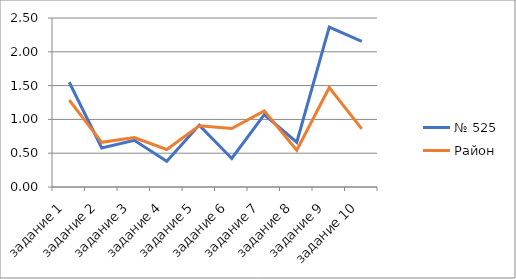
| Category | № 525 | Район |
|---|---|---|
| задание 1 | 1.549 | 1.284 |
| задание 2 | 0.577 | 0.661 |
| задание 3 | 0.69 | 0.733 |
| задание 4 | 0.38 | 0.555 |
| задание 5 | 0.915 | 0.906 |
| задание 6 | 0.423 | 0.865 |
| задание 7 | 1.07 | 1.127 |
| задание 8 | 0.662 | 0.543 |
| задание 9 | 2.366 | 1.472 |
| задание 10 | 2.155 | 0.859 |